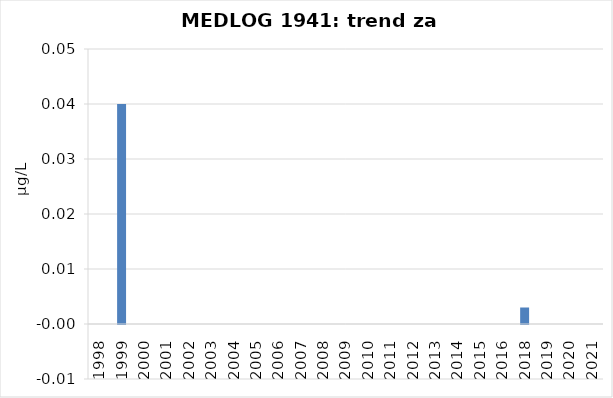
| Category | Vsota |
|---|---|
| 1998 | 0 |
| 1999 | 0.04 |
| 2000 | 0 |
| 2001 | 0 |
| 2002 | 0 |
| 2003 | 0 |
| 2004 | 0 |
| 2005 | 0 |
| 2006 | 0 |
| 2007 | 0 |
| 2008 | 0 |
| 2009 | 0 |
| 2010 | 0 |
| 2011 | 0 |
| 2012 | 0 |
| 2013 | 0 |
| 2014 | 0 |
| 2015 | 0 |
| 2016 | 0 |
| 2018 | 0.003 |
| 2019 | 0 |
| 2020 | 0 |
| 2021 | 0 |